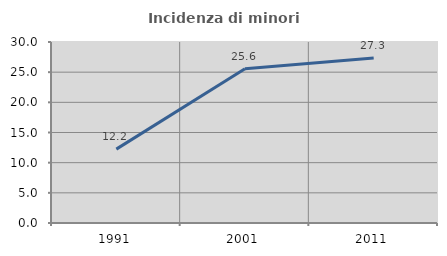
| Category | Incidenza di minori stranieri |
|---|---|
| 1991.0 | 12.245 |
| 2001.0 | 25.579 |
| 2011.0 | 27.333 |